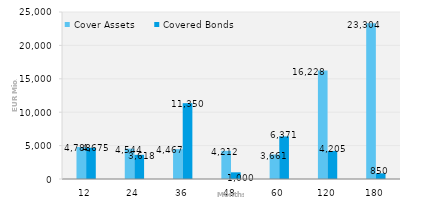
| Category | Cover Assets | Covered Bonds |
|---|---|---|
| 12.0 | 4788.081 | 4675 |
| 24.0 | 4544.299 | 3617.592 |
| 36.0 | 4467 | 11350 |
| 48.0 | 4211.631 | 1000 |
| 60.0 | 3661.359 | 6371.282 |
| 120.0 | 16227.611 | 4205.059 |
| 180.0 | 23303.847 | 850 |